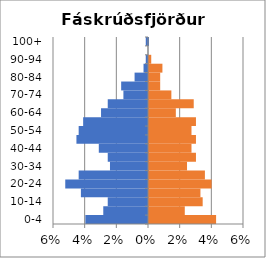
| Category | % Men | % Women |
|---|---|---|
| 0-4 | -0.04 | 0.042 |
| 5-9 | -0.028 | 0.023 |
| 10-14 | -0.025 | 0.034 |
| 15-19 | -0.042 | 0.032 |
| 20-24 | -0.052 | 0.04 |
| 25-29 | -0.044 | 0.035 |
| 30-34 | -0.024 | 0.024 |
| 35-39 | -0.025 | 0.03 |
| 40-44 | -0.031 | 0.027 |
| 45-49 | -0.045 | 0.03 |
| 50-54 | -0.044 | 0.027 |
| 55-59 | -0.041 | 0.03 |
| 60-64 | -0.03 | 0.017 |
| 65-69 | -0.025 | 0.028 |
| 70-74 | -0.016 | 0.014 |
| 75-79 | -0.017 | 0.007 |
| 80-84 | -0.008 | 0.007 |
| 85-89 | -0.003 | 0.008 |
| 90-94 | -0.001 | 0.001 |
| 95-99 | 0 | 0 |
| 100+ | -0.001 | 0 |